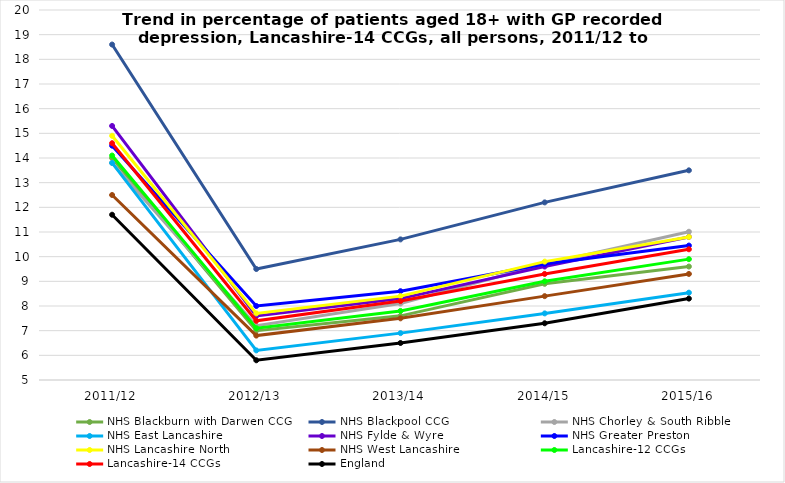
| Category | NHS Blackburn with Darwen CCG  | NHS Blackpool CCG | NHS Chorley & South Ribble | NHS East Lancashire | NHS Fylde & Wyre | NHS Greater Preston | NHS Lancashire North | NHS West Lancashire | Lancashire-12 CCGs | Lancashire-14 CCGs | England |
|---|---|---|---|---|---|---|---|---|---|---|---|
| 2011/12 | 14 | 18.6 | 13.8 | 13.8 | 15.3 | 14.5 | 14.9 | 12.5 | 14.1 | 14.6 | 11.7 |
| 2012/13 | 7 | 9.5 | 7.2 | 6.2 | 7.6 | 8 | 7.7 | 6.8 | 7.1 | 7.4 | 5.8 |
| 2013/14 | 7.6 | 10.7 | 8.1 | 6.9 | 8.3 | 8.6 | 8.4 | 7.5 | 7.8 | 8.2 | 6.5 |
| 2014/15 | 8.9 | 12.2 | 9.7 | 7.7 | 9.6 | 9.7 | 9.8 | 8.4 | 9 | 9.3 | 7.3 |
| 2015/16 | 9.6 | 13.5 | 11.01 | 8.54 | 10.8 | 10.45 | 10.8 | 9.3 | 9.9 | 10.3 | 8.3 |